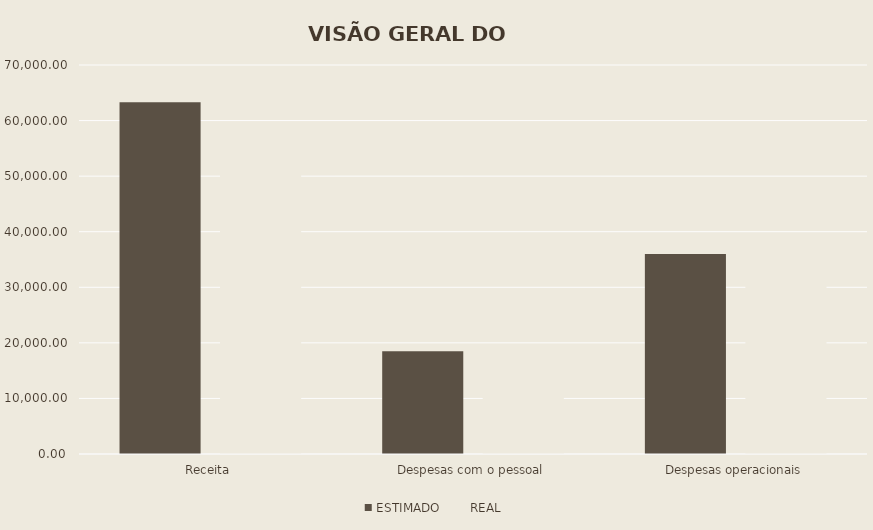
| Category | ESTIMADO | REAL |
|---|---|---|
| Receita | 63300 | 57450 |
| Despesas com o pessoal | 18500 | 14100 |
| Despesas operacionais | 36000 | 35530 |